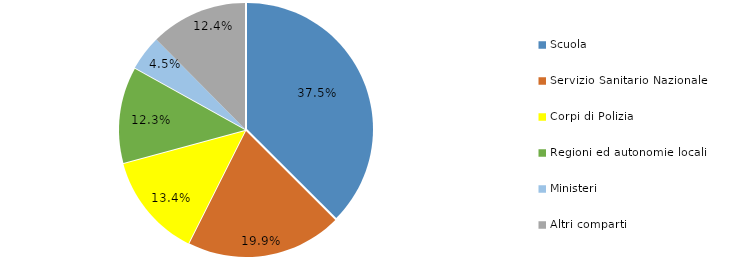
| Category | Series 0 |
|---|---|
| Scuola | 26721 |
| Servizio Sanitario Nazionale | 14227 |
| Corpi di Polizia | 9527 |
| Regioni ed autonomie locali | 8763 |
| Ministeri | 3222 |
| Altri comparti | 8856 |